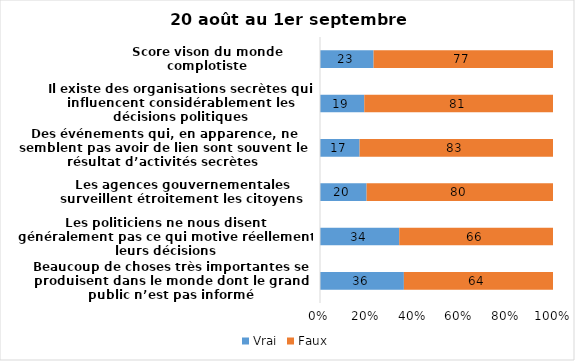
| Category | Vrai | Faux |
|---|---|---|
| Beaucoup de choses très importantes se produisent dans le monde dont le grand public n’est pas informé | 36 | 64 |
| Les politiciens ne nous disent généralement pas ce qui motive réellement leurs décisions | 34 | 66 |
| Les agences gouvernementales surveillent étroitement les citoyens | 20 | 80 |
| Des événements qui, en apparence, ne semblent pas avoir de lien sont souvent le résultat d’activités secrètes | 17 | 83 |
| Il existe des organisations secrètes qui influencent considérablement les décisions politiques | 19 | 81 |
| Score vison du monde complotiste | 23 | 77 |